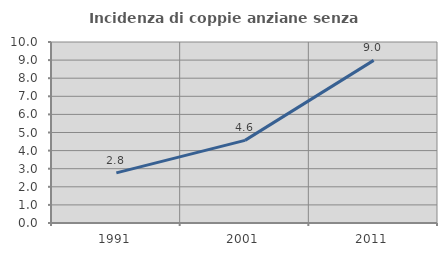
| Category | Incidenza di coppie anziane senza figli  |
|---|---|
| 1991.0 | 2.769 |
| 2001.0 | 4.566 |
| 2011.0 | 8.985 |